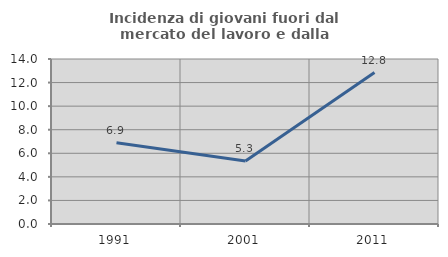
| Category | Incidenza di giovani fuori dal mercato del lavoro e dalla formazione  |
|---|---|
| 1991.0 | 6.897 |
| 2001.0 | 5.348 |
| 2011.0 | 12.849 |